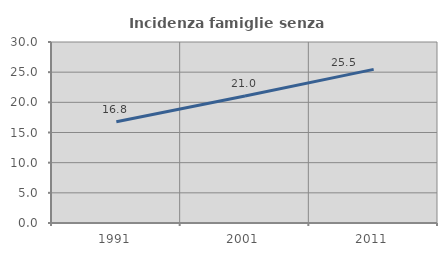
| Category | Incidenza famiglie senza nuclei |
|---|---|
| 1991.0 | 16.781 |
| 2001.0 | 21.047 |
| 2011.0 | 25.458 |